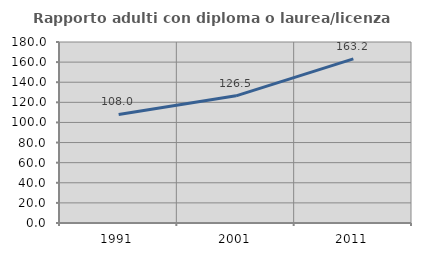
| Category | Rapporto adulti con diploma o laurea/licenza media  |
|---|---|
| 1991.0 | 107.956 |
| 2001.0 | 126.474 |
| 2011.0 | 163.157 |